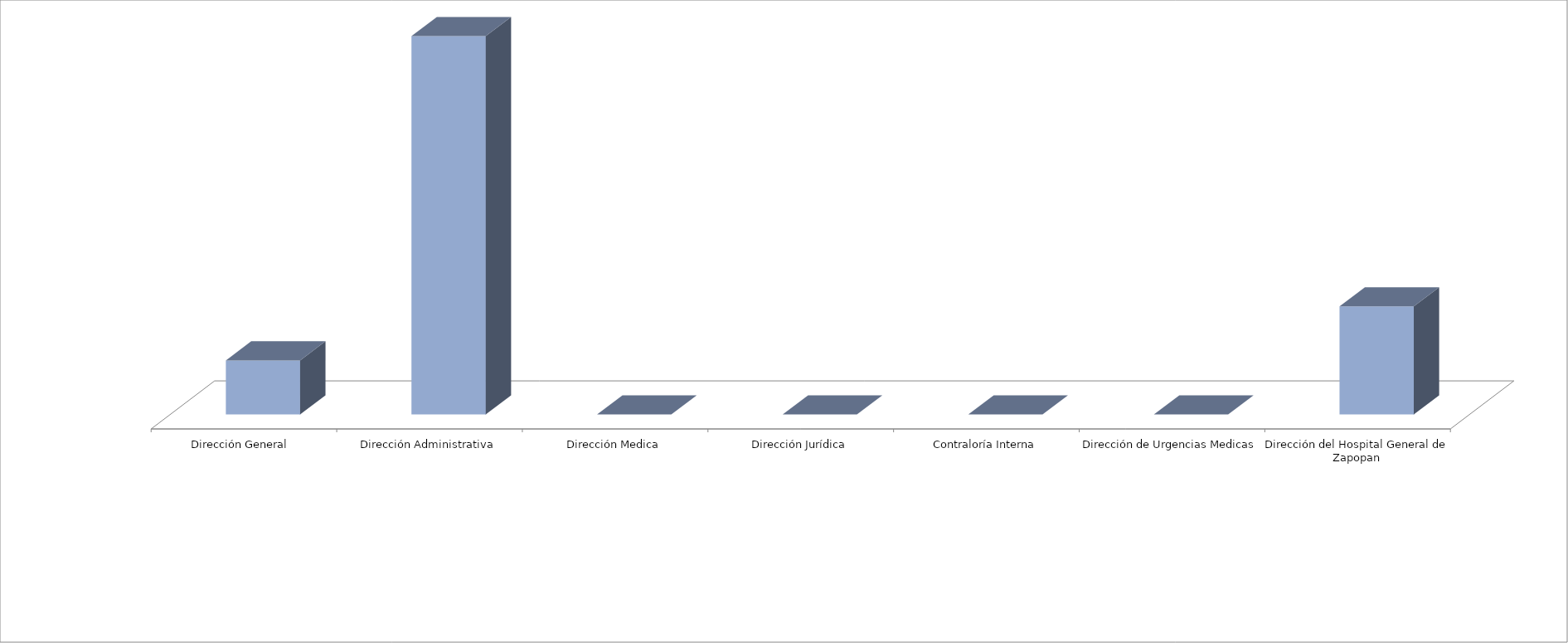
| Category | Series 0 | Series 1 |
|---|---|---|
| Dirección General  |  | 2 |
| Dirección Administrativa |  | 14 |
| Dirección Medica |  | 0 |
| Dirección Jurídica |  | 0 |
| Contraloría Interna |  | 0 |
| Dirección de Urgencias Medicas |  | 0 |
| Dirección del Hospital General de Zapopan |  | 4 |